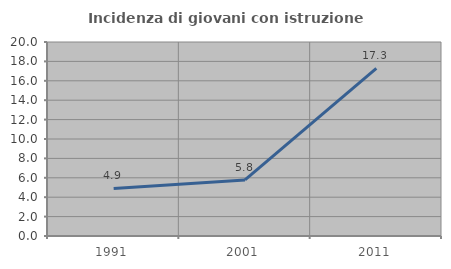
| Category | Incidenza di giovani con istruzione universitaria |
|---|---|
| 1991.0 | 4.908 |
| 2001.0 | 5.78 |
| 2011.0 | 17.273 |